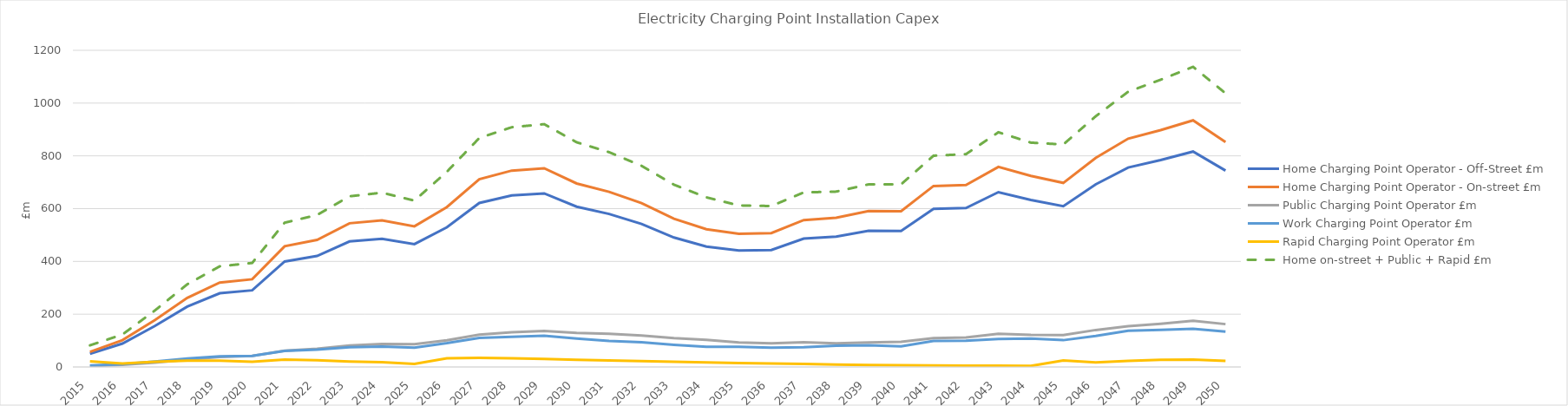
| Category | Home Charging Point Operator - Off-Street | Home Charging Point Operator - On-street | Public Charging Point Operator | Work Charging Point Operator | Rapid Charging Point Operator | Home on-street + Public + Rapid |
|---|---|---|---|---|---|---|
| 2015.0 | 50.109 | 57.364 | 3.289 | 5.642 | 21.206 | 81.859 |
| 2016.0 | 88.671 | 101.509 | 7.942 | 11.05 | 13.517 | 122.967 |
| 2017.0 | 155.115 | 177.572 | 16.521 | 20.601 | 19.852 | 213.946 |
| 2018.0 | 228.669 | 261.776 | 27.793 | 31.76 | 23.854 | 313.423 |
| 2019.0 | 279.485 | 319.95 | 37.559 | 40.256 | 23.903 | 381.411 |
| 2020.0 | 290.395 | 332.439 | 42.03 | 42.073 | 19.683 | 394.152 |
| 2021.0 | 399.566 | 457.416 | 61.645 | 60.543 | 27.651 | 546.712 |
| 2022.0 | 420.652 | 481.555 | 68.699 | 65.644 | 25.704 | 575.957 |
| 2023.0 | 475.735 | 544.612 | 81.527 | 74.526 | 20.59 | 646.729 |
| 2024.0 | 485.524 | 555.819 | 86.739 | 77.651 | 17.918 | 660.476 |
| 2025.0 | 465.642 | 533.058 | 86.085 | 73.257 | 11.244 | 630.387 |
| 2026.0 | 529.138 | 605.747 | 100.858 | 90.12 | 33.127 | 739.733 |
| 2027.0 | 621.393 | 711.359 | 122.105 | 110.305 | 34.143 | 867.607 |
| 2028.0 | 650.037 | 744.15 | 131.511 | 114.338 | 32.825 | 908.486 |
| 2029.0 | 657.725 | 752.951 | 136.601 | 118.051 | 30.564 | 920.116 |
| 2030.0 | 607.498 | 695.452 | 129.046 | 107.534 | 26.986 | 851.484 |
| 2031.0 | 579.897 | 663.855 | 125.56 | 98.239 | 24.628 | 814.042 |
| 2032.0 | 542.192 | 620.691 | 119.357 | 93.707 | 22.21 | 762.259 |
| 2033.0 | 490.629 | 561.663 | 109.545 | 84.229 | 19.55 | 690.758 |
| 2034.0 | 456.091 | 522.125 | 103.08 | 76.213 | 17.531 | 642.735 |
| 2035.0 | 441.05 | 504.905 | 92.559 | 76.433 | 14.702 | 612.167 |
| 2036.0 | 443.216 | 507.385 | 89.606 | 73.023 | 12.804 | 609.795 |
| 2037.0 | 486.315 | 556.725 | 93.394 | 75.025 | 11.353 | 661.472 |
| 2038.0 | 494.274 | 565.835 | 89.84 | 80.586 | 8.886 | 664.562 |
| 2039.0 | 516.428 | 591.197 | 93.203 | 82.093 | 7.556 | 691.956 |
| 2040.0 | 515.531 | 590.17 | 95.151 | 78.397 | 6.819 | 692.14 |
| 2041.0 | 599.122 | 685.863 | 108.931 | 98.629 | 5.815 | 800.61 |
| 2042.0 | 602.252 | 689.446 | 111.892 | 99.826 | 5.102 | 806.44 |
| 2043.0 | 662.422 | 758.329 | 126.088 | 106.066 | 5.054 | 889.471 |
| 2044.0 | 632.668 | 724.267 | 121.973 | 107.625 | 3.929 | 850.169 |
| 2045.0 | 609.368 | 697.593 | 120.594 | 101.537 | 24.954 | 843.141 |
| 2046.0 | 692.11 | 792.315 | 140.099 | 117.535 | 17.676 | 950.09 |
| 2047.0 | 755.837 | 865.268 | 154.565 | 137.412 | 23.25 | 1043.083 |
| 2048.0 | 783.895 | 897.388 | 163.908 | 140.693 | 27.203 | 1088.499 |
| 2049.0 | 816.297 | 934.481 | 175.078 | 144.3 | 27.832 | 1137.392 |
| 2050.0 | 744.199 | 851.945 | 162.303 | 133.763 | 23.032 | 1037.28 |